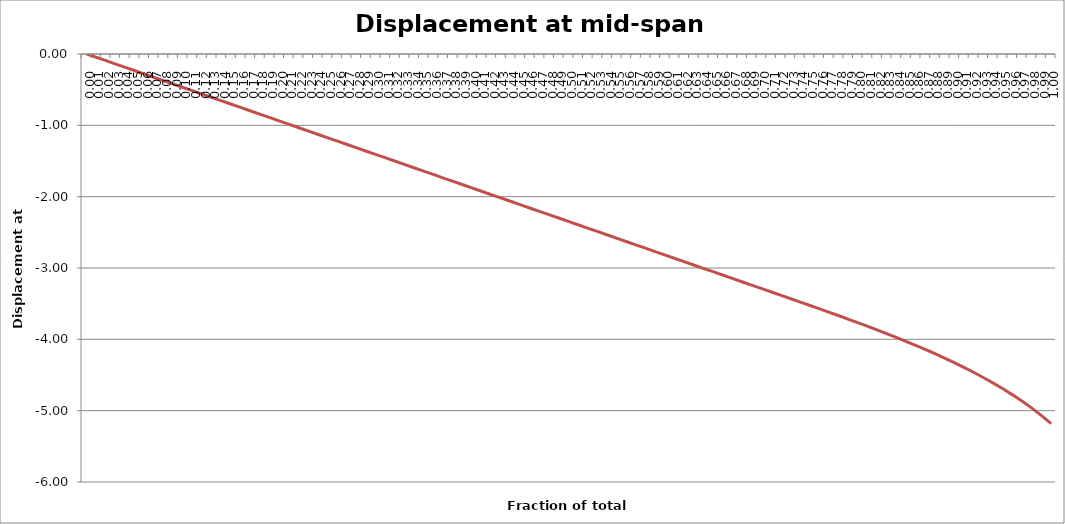
| Category | Displacement at mid-span [mm] |
|---|---|
| 0.0 | 0 |
| 0.01 | -0.047 |
| 0.02 | -0.094 |
| 0.03 | -0.141 |
| 0.04 | -0.188 |
| 0.05 | -0.235 |
| 0.06 | -0.282 |
| 0.06999999999999999 | -0.329 |
| 0.08 | -0.376 |
| 0.09 | -0.423 |
| 0.1 | -0.47 |
| 0.11000000000000001 | -0.517 |
| 0.12 | -0.564 |
| 0.13 | -0.611 |
| 0.13999999999999999 | -0.658 |
| 0.15 | -0.705 |
| 0.16 | -0.752 |
| 0.16999999999999998 | -0.799 |
| 0.18 | -0.846 |
| 0.19 | -0.893 |
| 0.2 | -0.94 |
| 0.21000000000000002 | -0.987 |
| 0.22000000000000003 | -1.034 |
| 0.22999999999999998 | -1.081 |
| 0.24 | -1.128 |
| 0.25 | -1.175 |
| 0.26 | -1.222 |
| 0.27 | -1.269 |
| 0.27999999999999997 | -1.316 |
| 0.29 | -1.363 |
| 0.3 | -1.41 |
| 0.31 | -1.457 |
| 0.32 | -1.504 |
| 0.32999999999999996 | -1.551 |
| 0.33999999999999997 | -1.598 |
| 0.35 | -1.645 |
| 0.36 | -1.692 |
| 0.37 | -1.739 |
| 0.38 | -1.786 |
| 0.39 | -1.833 |
| 0.4 | -1.88 |
| 0.41 | -1.927 |
| 0.42000000000000004 | -1.974 |
| 0.43 | -2.021 |
| 0.44000000000000006 | -2.068 |
| 0.45 | -2.115 |
| 0.45999999999999996 | -2.162 |
| 0.47000000000000003 | -2.209 |
| 0.48 | -2.256 |
| 0.49000000000000005 | -2.303 |
| 0.5 | -2.35 |
| 0.51 | -2.397 |
| 0.52 | -2.444 |
| 0.53 | -2.491 |
| 0.54 | -2.538 |
| 0.55 | -2.585 |
| 0.5599999999999999 | -2.632 |
| 0.5700000000000001 | -2.679 |
| 0.58 | -2.726 |
| 0.5900000000000001 | -2.773 |
| 0.6 | -2.82 |
| 0.61 | -2.867 |
| 0.62 | -2.914 |
| 0.63 | -2.961 |
| 0.64 | -3.008 |
| 0.65 | -3.055 |
| 0.6599999999999999 | -3.102 |
| 0.67 | -3.149 |
| 0.6799999999999999 | -3.196 |
| 0.6900000000000001 | -3.243 |
| 0.7 | -3.29 |
| 0.71 | -3.337 |
| 0.72 | -3.384 |
| 0.73 | -3.431 |
| 0.74 | -3.478 |
| 0.75 | -3.526 |
| 0.76 | -3.573 |
| 0.77 | -3.621 |
| 0.78 | -3.67 |
| 0.79 | -3.719 |
| 0.8 | -3.769 |
| 0.8099999999999999 | -3.819 |
| 0.82 | -3.871 |
| 0.8300000000000001 | -3.923 |
| 0.8400000000000001 | -3.977 |
| 0.85 | -4.032 |
| 0.86 | -4.088 |
| 0.8699999999999999 | -4.146 |
| 0.8800000000000001 | -4.205 |
| 0.89 | -4.267 |
| 0.9 | -4.33 |
| 0.9099999999999999 | -4.397 |
| 0.9199999999999999 | -4.465 |
| 0.93 | -4.538 |
| 0.9400000000000001 | -4.614 |
| 0.95 | -4.694 |
| 0.96 | -4.778 |
| 0.97 | -4.868 |
| 0.9800000000000001 | -4.964 |
| 0.99 | -5.068 |
| 1.0 | -5.181 |